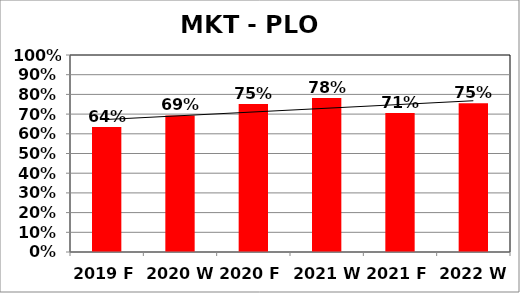
| Category | Series 0 |
|---|---|
| 2019 F | 0.635 |
| 2020 W | 0.693 |
| 2020 F | 0.752 |
| 2021 W | 0.781 |
| 2021 F | 0.706 |
| 2022 W | 0.755 |